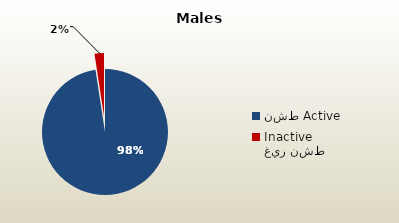
| Category | الذكور غير القطريين  Non-Qatari Males |
|---|---|
| نشط Active | 1801071 |
| غير نشط Inactive | 44594 |